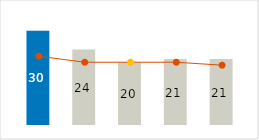
| Category | Power & Fuel |
|---|---|
| 0 | 30 |
| 1 | 24 |
| 2 | 20 |
| 3 | 21 |
| 4 | 21 |